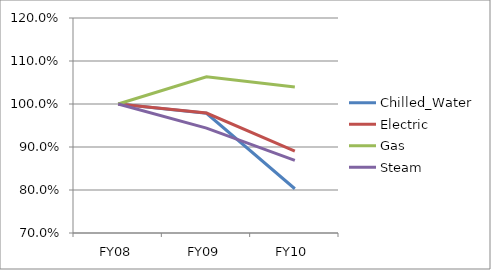
| Category | Chilled_Water | Electric | Gas | Steam |
|---|---|---|---|---|
| FY08 | 1 | 1 | 1 | 1 |
| FY09 | 0.978 | 0.979 | 1.063 | 0.944 |
| FY10 | 0.803 | 0.89 | 1.039 | 0.869 |